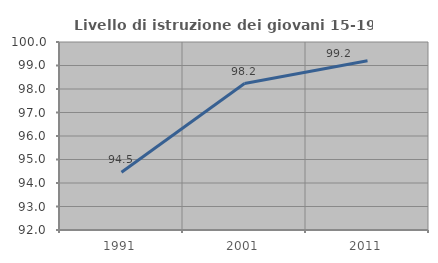
| Category | Livello di istruzione dei giovani 15-19 anni |
|---|---|
| 1991.0 | 94.461 |
| 2001.0 | 98.233 |
| 2011.0 | 99.201 |